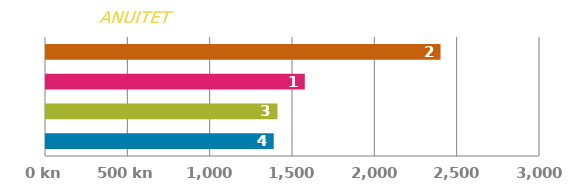
| Category | ANUITET |
|---|---|
| 0 | 1382.921 |
| 1 | 1405.775 |
| 2 | 1571.655 |
| 3 | 2396.046 |